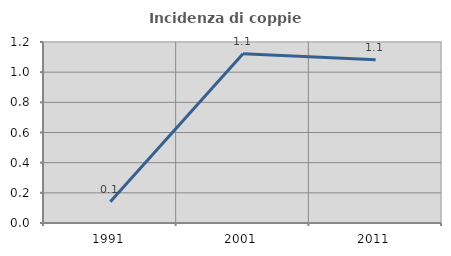
| Category | Incidenza di coppie miste |
|---|---|
| 1991.0 | 0.14 |
| 2001.0 | 1.123 |
| 2011.0 | 1.083 |